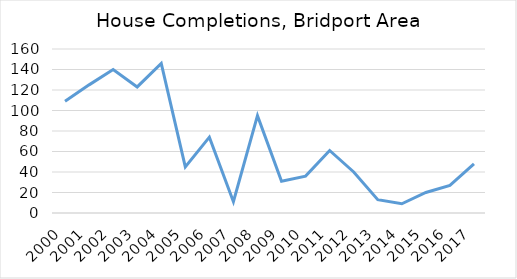
| Category | House Completions, Bridport Area |
|---|---|
| 2000.0 | 109 |
| 2001.0 | 125 |
| 2002.0 | 140 |
| 2003.0 | 123 |
| 2004.0 | 146 |
| 2005.0 | 45 |
| 2006.0 | 74 |
| 2007.0 | 11 |
| 2008.0 | 95 |
| 2009.0 | 31 |
| 2010.0 | 36 |
| 2011.0 | 61 |
| 2012.0 | 40 |
| 2013.0 | 13 |
| 2014.0 | 9 |
| 2015.0 | 20 |
| 2016.0 | 27 |
| 2017.0 | 48 |